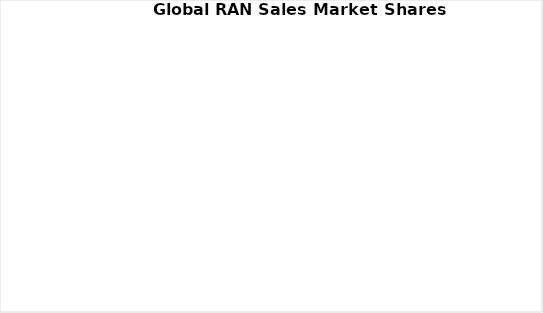
| Category | Series 0 | Series 1 |
|---|---|---|
| Ericsson | 0 | 0 |
| Fujitsu | 0 | 0 |
| Huawei | 0 | 0 |
| Mavenir | 0 | 0 |
| NEC | 0 | 0 |
| Nokia | 0 | 0 |
| Samsung | 0 | 0 |
| ZTE | 0 | 0 |
| Other | 0 | 0 |